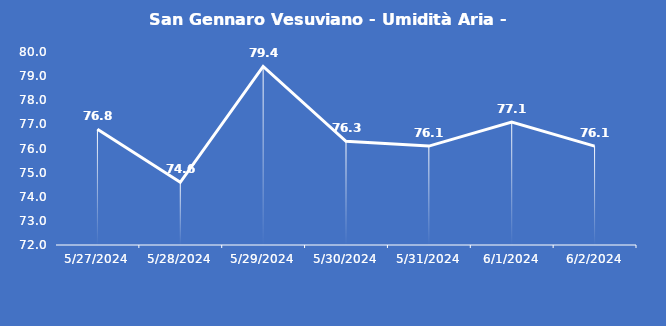
| Category | San Gennaro Vesuviano - Umidità Aria - Grezzo (%) |
|---|---|
| 5/27/24 | 76.8 |
| 5/28/24 | 74.6 |
| 5/29/24 | 79.4 |
| 5/30/24 | 76.3 |
| 5/31/24 | 76.1 |
| 6/1/24 | 77.1 |
| 6/2/24 | 76.1 |